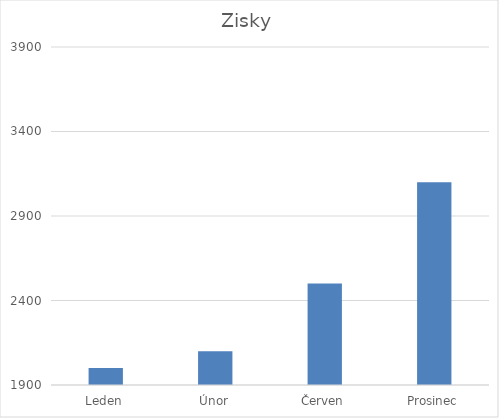
| Category | Zisky |
|---|---|
| Leden | 2000 |
| Únor | 2100 |
| Červen | 2500 |
| Prosinec | 3100 |